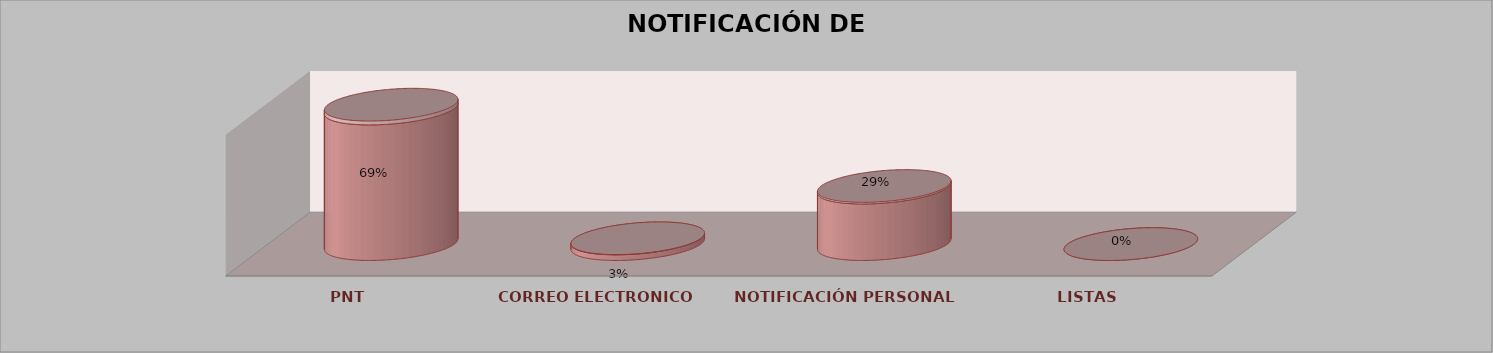
| Category | Series 0 | Series 1 | Series 2 | Series 3 | Series 4 |
|---|---|---|---|---|---|
| PNT |  |  |  | 24 | 0.686 |
| CORREO ELECTRONICO |  |  |  | 1 | 0.029 |
| NOTIFICACIÓN PERSONAL |  |  |  | 10 | 0.286 |
| LISTAS |  |  |  | 0 | 0 |